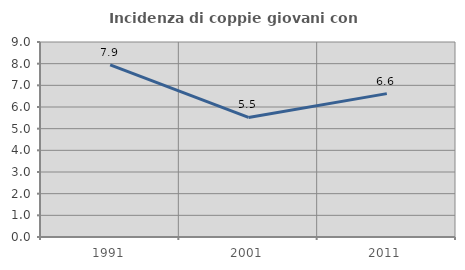
| Category | Incidenza di coppie giovani con figli |
|---|---|
| 1991.0 | 7.947 |
| 2001.0 | 5.517 |
| 2011.0 | 6.618 |